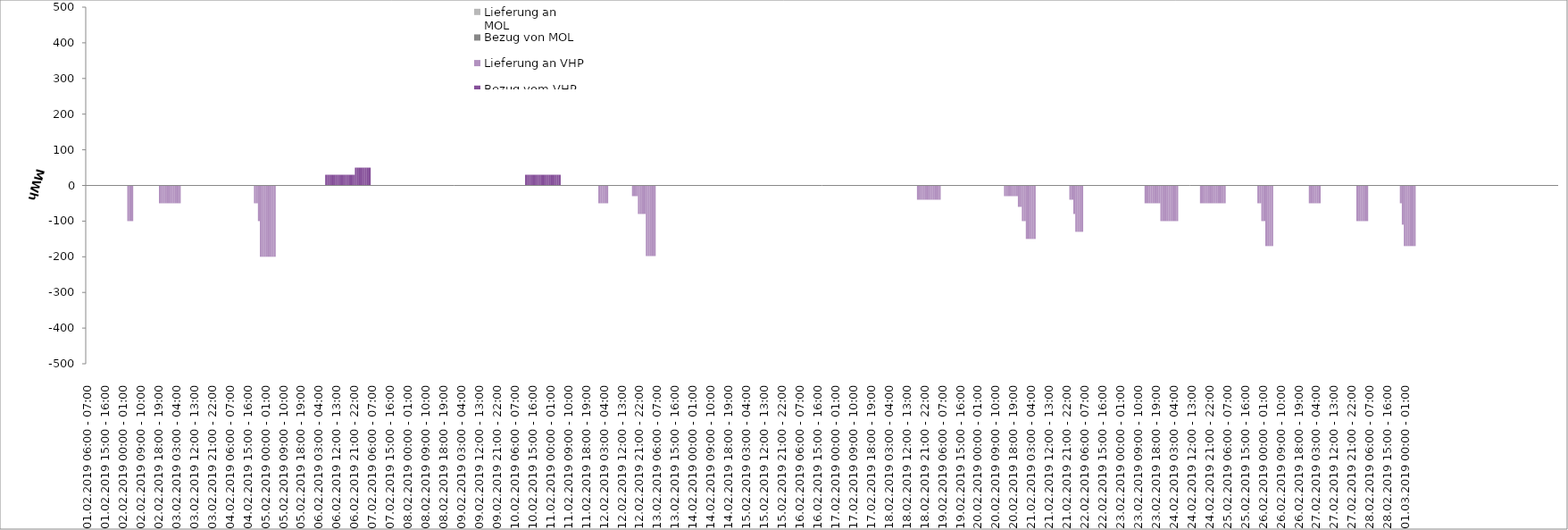
| Category | Bezug vom VHP | Lieferung an VHP | Bezug von MOL | Lieferung an MOL |
|---|---|---|---|---|
| 01.02.2019 06:00 - 07:00 | 0 | 0 | 0 | 0 |
| 01.02.2019 07:00 - 08:00 | 0 | 0 | 0 | 0 |
| 01.02.2019 08:00 - 09:00 | 0 | 0 | 0 | 0 |
| 01.02.2019 09:00 - 10:00 | 0 | 0 | 0 | 0 |
| 01.02.2019 10:00 - 11:00 | 0 | 0 | 0 | 0 |
| 01.02.2019 11:00 - 12:00 | 0 | 0 | 0 | 0 |
| 01.02.2019 12:00 - 13:00 | 0 | 0 | 0 | 0 |
| 01.02.2019 13:00 - 14:00 | 0 | 0 | 0 | 0 |
| 01.02.2019 14:00 - 15:00 | 0 | 0 | 0 | 0 |
| 01.02.2019 15:00 - 16:00 | 0 | 0 | 0 | 0 |
| 01.02.2019 16:00 - 17:00 | 0 | 0 | 0 | 0 |
| 01.02.2019 17:00 - 18:00 | 0 | 0 | 0 | 0 |
| 01.02.2019 18:00 - 19:00 | 0 | 0 | 0 | 0 |
| 01.02.2019 19:00 - 20:00 | 0 | 0 | 0 | 0 |
| 01.02.2019 20:00 - 21:00 | 0 | 0 | 0 | 0 |
| 01.02.2019 21:00 - 22:00 | 0 | 0 | 0 | 0 |
| 01.02.2019 22:00 - 23:00 | 0 | 0 | 0 | 0 |
| 01.02.2019 23:00 - 24:00 | 0 | 0 | 0 | 0 |
| 02.02.2019 00:00 - 01:00 | 0 | 0 | 0 | 0 |
| 02.02.2019 01:00 - 02:00 | 0 | 0 | 0 | 0 |
| 02.02.2019 02:00 - 03:00 | 0 | 0 | 0 | 0 |
| 02.02.2019 03:00 - 04:00 | 0 | -100 | 0 | 0 |
| 02.02.2019 04:00 - 05:00 | 0 | -100 | 0 | 0 |
| 02.02.2019 05:00 - 06:00 | 0 | -100 | 0 | 0 |
| 02.02.2019 06:00 - 07:00 | 0 | 0 | 0 | 0 |
| 02.02.2019 07:00 - 08:00 | 0 | 0 | 0 | 0 |
| 02.02.2019 08:00 - 09:00 | 0 | 0 | 0 | 0 |
| 02.02.2019 09:00 - 10:00 | 0 | 0 | 0 | 0 |
| 02.02.2019 10:00 - 11:00 | 0 | 0 | 0 | 0 |
| 02.02.2019 11:00 - 12:00 | 0 | 0 | 0 | 0 |
| 02.02.2019 12:00 - 13:00 | 0 | 0 | 0 | 0 |
| 02.02.2019 13:00 - 14:00 | 0 | 0 | 0 | 0 |
| 02.02.2019 14:00 - 15:00 | 0 | 0 | 0 | 0 |
| 02.02.2019 15:00 - 16:00 | 0 | 0 | 0 | 0 |
| 02.02.2019 16:00 - 17:00 | 0 | 0 | 0 | 0 |
| 02.02.2019 17:00 - 18:00 | 0 | 0 | 0 | 0 |
| 02.02.2019 18:00 - 19:00 | 0 | 0 | 0 | 0 |
| 02.02.2019 19:00 - 20:00 | 0 | -50 | 0 | 0 |
| 02.02.2019 20:00 - 21:00 | 0 | -50 | 0 | 0 |
| 02.02.2019 21:00 - 22:00 | 0 | -50 | 0 | 0 |
| 02.02.2019 22:00 - 23:00 | 0 | -50 | 0 | 0 |
| 02.02.2019 23:00 - 24:00 | 0 | -50 | 0 | 0 |
| 03.02.2019 00:00 - 01:00 | 0 | -50 | 0 | 0 |
| 03.02.2019 01:00 - 02:00 | 0 | -50 | 0 | 0 |
| 03.02.2019 02:00 - 03:00 | 0 | -50 | 0 | 0 |
| 03.02.2019 03:00 - 04:00 | 0 | -50 | 0 | 0 |
| 03.02.2019 04:00 - 05:00 | 0 | -50 | 0 | 0 |
| 03.02.2019 05:00 - 06:00 | 0 | -50 | 0 | 0 |
| 03.02.2019 06:00 - 07:00 | 0 | 0 | 0 | 0 |
| 03.02.2019 07:00 - 08:00 | 0 | 0 | 0 | 0 |
| 03.02.2019 08:00 - 09:00 | 0 | 0 | 0 | 0 |
| 03.02.2019 09:00 - 10:00 | 0 | 0 | 0 | 0 |
| 03.02.2019 10:00 - 11:00 | 0 | 0 | 0 | 0 |
| 03.02.2019 11:00 - 12:00 | 0 | 0 | 0 | 0 |
| 03.02.2019 12:00 - 13:00 | 0 | 0 | 0 | 0 |
| 03.02.2019 13:00 - 14:00 | 0 | 0 | 0 | 0 |
| 03.02.2019 14:00 - 15:00 | 0 | 0 | 0 | 0 |
| 03.02.2019 15:00 - 16:00 | 0 | 0 | 0 | 0 |
| 03.02.2019 16:00 - 17:00 | 0 | 0 | 0 | 0 |
| 03.02.2019 17:00 - 18:00 | 0 | 0 | 0 | 0 |
| 03.02.2019 18:00 - 19:00 | 0 | 0 | 0 | 0 |
| 03.02.2019 19:00 - 20:00 | 0 | 0 | 0 | 0 |
| 03.02.2019 20:00 - 21:00 | 0 | 0 | 0 | 0 |
| 03.02.2019 21:00 - 22:00 | 0 | 0 | 0 | 0 |
| 03.02.2019 22:00 - 23:00 | 0 | 0 | 0 | 0 |
| 03.02.2019 23:00 - 24:00 | 0 | 0 | 0 | 0 |
| 04.02.2019 00:00 - 01:00 | 0 | 0 | 0 | 0 |
| 04.02.2019 01:00 - 02:00 | 0 | 0 | 0 | 0 |
| 04.02.2019 02:00 - 03:00 | 0 | 0 | 0 | 0 |
| 04.02.2019 03:00 - 04:00 | 0 | 0 | 0 | 0 |
| 04.02.2019 04:00 - 05:00 | 0 | 0 | 0 | 0 |
| 04.02.2019 05:00 - 06:00 | 0 | 0 | 0 | 0 |
| 04.02.2019 06:00 - 07:00 | 0 | 0 | 0 | 0 |
| 04.02.2019 07:00 - 08:00 | 0 | 0 | 0 | 0 |
| 04.02.2019 08:00 - 09:00 | 0 | 0 | 0 | 0 |
| 04.02.2019 09:00 - 10:00 | 0 | 0 | 0 | 0 |
| 04.02.2019 10:00 - 11:00 | 0 | 0 | 0 | 0 |
| 04.02.2019 11:00 - 12:00 | 0 | 0 | 0 | 0 |
| 04.02.2019 12:00 - 13:00 | 0 | 0 | 0 | 0 |
| 04.02.2019 13:00 - 14:00 | 0 | 0 | 0 | 0 |
| 04.02.2019 14:00 - 15:00 | 0 | 0 | 0 | 0 |
| 04.02.2019 15:00 - 16:00 | 0 | 0 | 0 | 0 |
| 04.02.2019 16:00 - 17:00 | 0 | 0 | 0 | 0 |
| 04.02.2019 17:00 - 18:00 | 0 | 0 | 0 | 0 |
| 04.02.2019 18:00 - 19:00 | 0 | 0 | 0 | 0 |
| 04.02.2019 19:00 - 20:00 | 0 | -50 | 0 | 0 |
| 04.02.2019 20:00 - 21:00 | 0 | -50 | 0 | 0 |
| 04.02.2019 21:00 - 22:00 | 0 | -100 | 0 | 0 |
| 04.02.2019 22:00 - 23:00 | 0 | -200 | 0 | 0 |
| 04.02.2019 23:00 - 24:00 | 0 | -200 | 0 | 0 |
| 05.02.2019 00:00 - 01:00 | 0 | -200 | 0 | 0 |
| 05.02.2019 01:00 - 02:00 | 0 | -200 | 0 | 0 |
| 05.02.2019 02:00 - 03:00 | 0 | -200 | 0 | 0 |
| 05.02.2019 03:00 - 04:00 | 0 | -200 | 0 | 0 |
| 05.02.2019 04:00 - 05:00 | 0 | -200 | 0 | 0 |
| 05.02.2019 05:00 - 06:00 | 0 | -200 | 0 | 0 |
| 05.02.2019 06:00 - 07:00 | 0 | 0 | 0 | 0 |
| 05.02.2019 07:00 - 08:00 | 0 | 0 | 0 | 0 |
| 05.02.2019 08:00 - 09:00 | 0 | 0 | 0 | 0 |
| 05.02.2019 09:00 - 10:00 | 0 | 0 | 0 | 0 |
| 05.02.2019 10:00 - 11:00 | 0 | 0 | 0 | 0 |
| 05.02.2019 11:00 - 12:00 | 0 | 0 | 0 | 0 |
| 05.02.2019 12:00 - 13:00 | 0 | 0 | 0 | 0 |
| 05.02.2019 13:00 - 14:00 | 0 | 0 | 0 | 0 |
| 05.02.2019 14:00 - 15:00 | 0 | 0 | 0 | 0 |
| 05.02.2019 15:00 - 16:00 | 0 | 0 | 0 | 0 |
| 05.02.2019 16:00 - 17:00 | 0 | 0 | 0 | 0 |
| 05.02.2019 17:00 - 18:00 | 0 | 0 | 0 | 0 |
| 05.02.2019 18:00 - 19:00 | 0 | 0 | 0 | 0 |
| 05.02.2019 19:00 - 20:00 | 0 | 0 | 0 | 0 |
| 05.02.2019 20:00 - 21:00 | 0 | 0 | 0 | 0 |
| 05.02.2019 21:00 - 22:00 | 0 | 0 | 0 | 0 |
| 05.02.2019 22:00 - 23:00 | 0 | 0 | 0 | 0 |
| 05.02.2019 23:00 - 24:00 | 0 | 0 | 0 | 0 |
| 06.02.2019 00:00 - 01:00 | 0 | 0 | 0 | 0 |
| 06.02.2019 01:00 - 02:00 | 0 | 0 | 0 | 0 |
| 06.02.2019 02:00 - 03:00 | 0 | 0 | 0 | 0 |
| 06.02.2019 03:00 - 04:00 | 0 | 0 | 0 | 0 |
| 06.02.2019 04:00 - 05:00 | 0 | 0 | 0 | 0 |
| 06.02.2019 05:00 - 06:00 | 0 | 0 | 0 | 0 |
| 06.02.2019 06:00 - 07:00 | 0 | 0 | 0 | 0 |
| 06.02.2019 07:00 - 08:00 | 30 | 0 | 0 | 0 |
| 06.02.2019 08:00 - 09:00 | 30 | 0 | 0 | 0 |
| 06.02.2019 09:00 - 10:00 | 30 | 0 | 0 | 0 |
| 06.02.2019 10:00 - 11:00 | 30 | 0 | 0 | 0 |
| 06.02.2019 11:00 - 12:00 | 30 | 0 | 0 | 0 |
| 06.02.2019 12:00 - 13:00 | 30 | 0 | 0 | 0 |
| 06.02.2019 13:00 - 14:00 | 30 | 0 | 0 | 0 |
| 06.02.2019 14:00 - 15:00 | 30 | 0 | 0 | 0 |
| 06.02.2019 15:00 - 16:00 | 30 | 0 | 0 | 0 |
| 06.02.2019 16:00 - 17:00 | 30 | 0 | 0 | 0 |
| 06.02.2019 17:00 - 18:00 | 30 | 0 | 0 | 0 |
| 06.02.2019 18:00 - 19:00 | 30 | 0 | 0 | 0 |
| 06.02.2019 19:00 - 20:00 | 30 | 0 | 0 | 0 |
| 06.02.2019 20:00 - 21:00 | 30 | 0 | 0 | 0 |
| 06.02.2019 21:00 - 22:00 | 30 | 0 | 0 | 0 |
| 06.02.2019 22:00 - 23:00 | 50 | 0 | 0 | 0 |
| 06.02.2019 23:00 - 24:00 | 50 | 0 | 0 | 0 |
| 07.02.2019 00:00 - 01:00 | 50 | 0 | 0 | 0 |
| 07.02.2019 01:00 - 02:00 | 50 | 0 | 0 | 0 |
| 07.02.2019 02:00 - 03:00 | 50 | 0 | 0 | 0 |
| 07.02.2019 03:00 - 04:00 | 50 | 0 | 0 | 0 |
| 07.02.2019 04:00 - 05:00 | 50 | 0 | 0 | 0 |
| 07.02.2019 05:00 - 06:00 | 50 | 0 | 0 | 0 |
| 07.02.2019 06:00 - 07:00 | 0 | 0 | 0 | 0 |
| 07.02.2019 07:00 - 08:00 | 0 | 0 | 0 | 0 |
| 07.02.2019 08:00 - 09:00 | 0 | 0 | 0 | 0 |
| 07.02.2019 09:00 - 10:00 | 0 | 0 | 0 | 0 |
| 07.02.2019 10:00 - 11:00 | 0 | 0 | 0 | 0 |
| 07.02.2019 11:00 - 12:00 | 0 | 0 | 0 | 0 |
| 07.02.2019 12:00 - 13:00 | 0 | 0 | 0 | 0 |
| 07.02.2019 13:00 - 14:00 | 0 | 0 | 0 | 0 |
| 07.02.2019 14:00 - 15:00 | 0 | 0 | 0 | 0 |
| 07.02.2019 15:00 - 16:00 | 0 | 0 | 0 | 0 |
| 07.02.2019 16:00 - 17:00 | 0 | 0 | 0 | 0 |
| 07.02.2019 17:00 - 18:00 | 0 | 0 | 0 | 0 |
| 07.02.2019 18:00 - 19:00 | 0 | 0 | 0 | 0 |
| 07.02.2019 19:00 - 20:00 | 0 | 0 | 0 | 0 |
| 07.02.2019 20:00 - 21:00 | 0 | 0 | 0 | 0 |
| 07.02.2019 21:00 - 22:00 | 0 | 0 | 0 | 0 |
| 07.02.2019 22:00 - 23:00 | 0 | 0 | 0 | 0 |
| 07.02.2019 23:00 - 24:00 | 0 | 0 | 0 | 0 |
| 08.02.2019 00:00 - 01:00 | 0 | 0 | 0 | 0 |
| 08.02.2019 01:00 - 02:00 | 0 | 0 | 0 | 0 |
| 08.02.2019 02:00 - 03:00 | 0 | 0 | 0 | 0 |
| 08.02.2019 03:00 - 04:00 | 0 | 0 | 0 | 0 |
| 08.02.2019 04:00 - 05:00 | 0 | 0 | 0 | 0 |
| 08.02.2019 05:00 - 06:00 | 0 | 0 | 0 | 0 |
| 08.02.2019 06:00 - 07:00 | 0 | 0 | 0 | 0 |
| 08.02.2019 07:00 - 08:00 | 0 | 0 | 0 | 0 |
| 08.02.2019 08:00 - 09:00 | 0 | 0 | 0 | 0 |
| 08.02.2019 09:00 - 10:00 | 0 | 0 | 0 | 0 |
| 08.02.2019 10:00 - 11:00 | 0 | 0 | 0 | 0 |
| 08.02.2019 11:00 - 12:00 | 0 | 0 | 0 | 0 |
| 08.02.2019 12:00 - 13:00 | 0 | 0 | 0 | 0 |
| 08.02.2019 13:00 - 14:00 | 0 | 0 | 0 | 0 |
| 08.02.2019 14:00 - 15:00 | 0 | 0 | 0 | 0 |
| 08.02.2019 15:00 - 16:00 | 0 | 0 | 0 | 0 |
| 08.02.2019 16:00 - 17:00 | 0 | 0 | 0 | 0 |
| 08.02.2019 17:00 - 18:00 | 0 | 0 | 0 | 0 |
| 08.02.2019 18:00 - 19:00 | 0 | 0 | 0 | 0 |
| 08.02.2019 19:00 - 20:00 | 0 | 0 | 0 | 0 |
| 08.02.2019 20:00 - 21:00 | 0 | 0 | 0 | 0 |
| 08.02.2019 21:00 - 22:00 | 0 | 0 | 0 | 0 |
| 08.02.2019 22:00 - 23:00 | 0 | 0 | 0 | 0 |
| 08.02.2019 23:00 - 24:00 | 0 | 0 | 0 | 0 |
| 09.02.2019 00:00 - 01:00 | 0 | 0 | 0 | 0 |
| 09.02.2019 01:00 - 02:00 | 0 | 0 | 0 | 0 |
| 09.02.2019 02:00 - 03:00 | 0 | 0 | 0 | 0 |
| 09.02.2019 03:00 - 04:00 | 0 | 0 | 0 | 0 |
| 09.02.2019 04:00 - 05:00 | 0 | 0 | 0 | 0 |
| 09.02.2019 05:00 - 06:00 | 0 | 0 | 0 | 0 |
| 09.02.2019 06:00 - 07:00 | 0 | 0 | 0 | 0 |
| 09.02.2019 07:00 - 08:00 | 0 | 0 | 0 | 0 |
| 09.02.2019 08:00 - 09:00 | 0 | 0 | 0 | 0 |
| 09.02.2019 09:00 - 10:00 | 0 | 0 | 0 | 0 |
| 09.02.2019 10:00 - 11:00 | 0 | 0 | 0 | 0 |
| 09.02.2019 11:00 - 12:00 | 0 | 0 | 0 | 0 |
| 09.02.2019 12:00 - 13:00 | 0 | 0 | 0 | 0 |
| 09.02.2019 13:00 - 14:00 | 0 | 0 | 0 | 0 |
| 09.02.2019 14:00 - 15:00 | 0 | 0 | 0 | 0 |
| 09.02.2019 15:00 - 16:00 | 0 | 0 | 0 | 0 |
| 09.02.2019 16:00 - 17:00 | 0 | 0 | 0 | 0 |
| 09.02.2019 17:00 - 18:00 | 0 | 0 | 0 | 0 |
| 09.02.2019 18:00 - 19:00 | 0 | 0 | 0 | 0 |
| 09.02.2019 19:00 - 20:00 | 0 | 0 | 0 | 0 |
| 09.02.2019 20:00 - 21:00 | 0 | 0 | 0 | 0 |
| 09.02.2019 21:00 - 22:00 | 0 | 0 | 0 | 0 |
| 09.02.2019 22:00 - 23:00 | 0 | 0 | 0 | 0 |
| 09.02.2019 23:00 - 24:00 | 0 | 0 | 0 | 0 |
| 10.02.2019 00:00 - 01:00 | 0 | 0 | 0 | 0 |
| 10.02.2019 01:00 - 02:00 | 0 | 0 | 0 | 0 |
| 10.02.2019 02:00 - 03:00 | 0 | 0 | 0 | 0 |
| 10.02.2019 03:00 - 04:00 | 0 | 0 | 0 | 0 |
| 10.02.2019 04:00 - 05:00 | 0 | 0 | 0 | 0 |
| 10.02.2019 05:00 - 06:00 | 0 | 0 | 0 | 0 |
| 10.02.2019 06:00 - 07:00 | 0 | 0 | 0 | 0 |
| 10.02.2019 07:00 - 08:00 | 0 | 0 | 0 | 0 |
| 10.02.2019 08:00 - 09:00 | 0 | 0 | 0 | 0 |
| 10.02.2019 09:00 - 10:00 | 0 | 0 | 0 | 0 |
| 10.02.2019 10:00 - 11:00 | 0 | 0 | 0 | 0 |
| 10.02.2019 11:00 - 12:00 | 0 | 0 | 0 | 0 |
| 10.02.2019 12:00 - 13:00 | 30 | 0 | 0 | 0 |
| 10.02.2019 13:00 - 14:00 | 30 | 0 | 0 | 0 |
| 10.02.2019 14:00 - 15:00 | 30 | 0 | 0 | 0 |
| 10.02.2019 15:00 - 16:00 | 30 | 0 | 0 | 0 |
| 10.02.2019 16:00 - 17:00 | 30 | 0 | 0 | 0 |
| 10.02.2019 17:00 - 18:00 | 30 | 0 | 0 | 0 |
| 10.02.2019 18:00 - 19:00 | 30 | 0 | 0 | 0 |
| 10.02.2019 19:00 - 20:00 | 30 | 0 | 0 | 0 |
| 10.02.2019 20:00 - 21:00 | 30 | 0 | 0 | 0 |
| 10.02.2019 21:00 - 22:00 | 30 | 0 | 0 | 0 |
| 10.02.2019 22:00 - 23:00 | 30 | 0 | 0 | 0 |
| 10.02.2019 23:00 - 24:00 | 30 | 0 | 0 | 0 |
| 11.02.2019 00:00 - 01:00 | 30 | 0 | 0 | 0 |
| 11.02.2019 01:00 - 02:00 | 30 | 0 | 0 | 0 |
| 11.02.2019 02:00 - 03:00 | 30 | 0 | 0 | 0 |
| 11.02.2019 03:00 - 04:00 | 30 | 0 | 0 | 0 |
| 11.02.2019 04:00 - 05:00 | 30 | 0 | 0 | 0 |
| 11.02.2019 05:00 - 06:00 | 30 | 0 | 0 | 0 |
| 11.02.2019 06:00 - 07:00 | 0 | 0 | 0 | 0 |
| 11.02.2019 07:00 - 08:00 | 0 | 0 | 0 | 0 |
| 11.02.2019 08:00 - 09:00 | 0 | 0 | 0 | 0 |
| 11.02.2019 09:00 - 10:00 | 0 | 0 | 0 | 0 |
| 11.02.2019 10:00 - 11:00 | 0 | 0 | 0 | 0 |
| 11.02.2019 11:00 - 12:00 | 0 | 0 | 0 | 0 |
| 11.02.2019 12:00 - 13:00 | 0 | 0 | 0 | 0 |
| 11.02.2019 13:00 - 14:00 | 0 | 0 | 0 | 0 |
| 11.02.2019 14:00 - 15:00 | 0 | 0 | 0 | 0 |
| 11.02.2019 15:00 - 16:00 | 0 | 0 | 0 | 0 |
| 11.02.2019 16:00 - 17:00 | 0 | 0 | 0 | 0 |
| 11.02.2019 17:00 - 18:00 | 0 | 0 | 0 | 0 |
| 11.02.2019 18:00 - 19:00 | 0 | 0 | 0 | 0 |
| 11.02.2019 19:00 - 20:00 | 0 | 0 | 0 | 0 |
| 11.02.2019 20:00 - 21:00 | 0 | 0 | 0 | 0 |
| 11.02.2019 21:00 - 22:00 | 0 | 0 | 0 | 0 |
| 11.02.2019 22:00 - 23:00 | 0 | 0 | 0 | 0 |
| 11.02.2019 23:00 - 24:00 | 0 | 0 | 0 | 0 |
| 12.02.2019 00:00 - 01:00 | 0 | 0 | 0 | 0 |
| 12.02.2019 01:00 - 02:00 | 0 | -50 | 0 | 0 |
| 12.02.2019 02:00 - 03:00 | 0 | -50 | 0 | 0 |
| 12.02.2019 03:00 - 04:00 | 0 | -50 | 0 | 0 |
| 12.02.2019 04:00 - 05:00 | 0 | -50 | 0 | 0 |
| 12.02.2019 05:00 - 06:00 | 0 | -50 | 0 | 0 |
| 12.02.2019 06:00 - 07:00 | 0 | 0 | 0 | 0 |
| 12.02.2019 07:00 - 08:00 | 0 | 0 | 0 | 0 |
| 12.02.2019 08:00 - 09:00 | 0 | 0 | 0 | 0 |
| 12.02.2019 09:00 - 10:00 | 0 | 0 | 0 | 0 |
| 12.02.2019 10:00 - 11:00 | 0 | 0 | 0 | 0 |
| 12.02.2019 11:00 - 12:00 | 0 | 0 | 0 | 0 |
| 12.02.2019 12:00 - 13:00 | 0 | 0 | 0 | 0 |
| 12.02.2019 13:00 - 14:00 | 0 | 0 | 0 | 0 |
| 12.02.2019 14:00 - 15:00 | 0 | 0 | 0 | 0 |
| 12.02.2019 15:00 - 16:00 | 0 | 0 | 0 | 0 |
| 12.02.2019 16:00 - 17:00 | 0 | 0 | 0 | 0 |
| 12.02.2019 17:00 - 18:00 | 0 | 0 | 0 | 0 |
| 12.02.2019 18:00 - 19:00 | 0 | -30 | 0 | 0 |
| 12.02.2019 19:00 - 20:00 | 0 | -30 | 0 | 0 |
| 12.02.2019 20:00 - 21:00 | 0 | -30 | 0 | 0 |
| 12.02.2019 21:00 - 22:00 | 0 | -80 | 0 | 0 |
| 12.02.2019 22:00 - 23:00 | 0 | -80 | 0 | 0 |
| 12.02.2019 23:00 - 24:00 | 0 | -80 | 0 | 0 |
| 13.02.2019 00:00 - 01:00 | 0 | -80 | 0 | 0 |
| 13.02.2019 01:00 - 02:00 | 0 | -198 | 0 | 0 |
| 13.02.2019 02:00 - 03:00 | 0 | -198 | 0 | 0 |
| 13.02.2019 03:00 - 04:00 | 0 | -198 | 0 | 0 |
| 13.02.2019 04:00 - 05:00 | 0 | -198 | 0 | 0 |
| 13.02.2019 05:00 - 06:00 | 0 | -198 | 0 | 0 |
| 13.02.2019 06:00 - 07:00 | 0 | 0 | 0 | 0 |
| 13.02.2019 07:00 - 08:00 | 0 | 0 | 0 | 0 |
| 13.02.2019 08:00 - 09:00 | 0 | 0 | 0 | 0 |
| 13.02.2019 09:00 - 10:00 | 0 | 0 | 0 | 0 |
| 13.02.2019 10:00 - 11:00 | 0 | 0 | 0 | 0 |
| 13.02.2019 11:00 - 12:00 | 0 | 0 | 0 | 0 |
| 13.02.2019 12:00 - 13:00 | 0 | 0 | 0 | 0 |
| 13.02.2019 13:00 - 14:00 | 0 | 0 | 0 | 0 |
| 13.02.2019 14:00 - 15:00 | 0 | 0 | 0 | 0 |
| 13.02.2019 15:00 - 16:00 | 0 | 0 | 0 | 0 |
| 13.02.2019 16:00 - 17:00 | 0 | 0 | 0 | 0 |
| 13.02.2019 17:00 - 18:00 | 0 | 0 | 0 | 0 |
| 13.02.2019 18:00 - 19:00 | 0 | 0 | 0 | 0 |
| 13.02.2019 19:00 - 20:00 | 0 | 0 | 0 | 0 |
| 13.02.2019 20:00 - 21:00 | 0 | 0 | 0 | 0 |
| 13.02.2019 21:00 - 22:00 | 0 | 0 | 0 | 0 |
| 13.02.2019 22:00 - 23:00 | 0 | 0 | 0 | 0 |
| 13.02.2019 23:00 - 24:00 | 0 | 0 | 0 | 0 |
| 14.02.2019 00:00 - 01:00 | 0 | 0 | 0 | 0 |
| 14.02.2019 01:00 - 02:00 | 0 | 0 | 0 | 0 |
| 14.02.2019 02:00 - 03:00 | 0 | 0 | 0 | 0 |
| 14.02.2019 03:00 - 04:00 | 0 | 0 | 0 | 0 |
| 14.02.2019 04:00 - 05:00 | 0 | 0 | 0 | 0 |
| 14.02.2019 05:00 - 06:00 | 0 | 0 | 0 | 0 |
| 14.02.2019 06:00 - 07:00 | 0 | 0 | 0 | 0 |
| 14.02.2019 07:00 - 08:00 | 0 | 0 | 0 | 0 |
| 14.02.2019 08:00 - 09:00 | 0 | 0 | 0 | 0 |
| 14.02.2019 09:00 - 10:00 | 0 | 0 | 0 | 0 |
| 14.02.2019 10:00 - 11:00 | 0 | 0 | 0 | 0 |
| 14.02.2019 11:00 - 12:00 | 0 | 0 | 0 | 0 |
| 14.02.2019 12:00 - 13:00 | 0 | 0 | 0 | 0 |
| 14.02.2019 13:00 - 14:00 | 0 | 0 | 0 | 0 |
| 14.02.2019 14:00 - 15:00 | 0 | 0 | 0 | 0 |
| 14.02.2019 15:00 - 16:00 | 0 | 0 | 0 | 0 |
| 14.02.2019 16:00 - 17:00 | 0 | 0 | 0 | 0 |
| 14.02.2019 17:00 - 18:00 | 0 | 0 | 0 | 0 |
| 14.02.2019 18:00 - 19:00 | 0 | 0 | 0 | 0 |
| 14.02.2019 19:00 - 20:00 | 0 | 0 | 0 | 0 |
| 14.02.2019 20:00 - 21:00 | 0 | 0 | 0 | 0 |
| 14.02.2019 21:00 - 22:00 | 0 | 0 | 0 | 0 |
| 14.02.2019 22:00 - 23:00 | 0 | 0 | 0 | 0 |
| 14.02.2019 23:00 - 24:00 | 0 | 0 | 0 | 0 |
| 15.02.2019 00:00 - 01:00 | 0 | 0 | 0 | 0 |
| 15.02.2019 01:00 - 02:00 | 0 | 0 | 0 | 0 |
| 15.02.2019 02:00 - 03:00 | 0 | 0 | 0 | 0 |
| 15.02.2019 03:00 - 04:00 | 0 | 0 | 0 | 0 |
| 15.02.2019 04:00 - 05:00 | 0 | 0 | 0 | 0 |
| 15.02.2019 05:00 - 06:00 | 0 | 0 | 0 | 0 |
| 15.02.2019 06:00 - 07:00 | 0 | 0 | 0 | 0 |
| 15.02.2019 07:00 - 08:00 | 0 | 0 | 0 | 0 |
| 15.02.2019 08:00 - 09:00 | 0 | 0 | 0 | 0 |
| 15.02.2019 09:00 - 10:00 | 0 | 0 | 0 | 0 |
| 15.02.2019 10:00 - 11:00 | 0 | 0 | 0 | 0 |
| 15.02.2019 11:00 - 12:00 | 0 | 0 | 0 | 0 |
| 15.02.2019 12:00 - 13:00 | 0 | 0 | 0 | 0 |
| 15.02.2019 13:00 - 14:00 | 0 | 0 | 0 | 0 |
| 15.02.2019 14:00 - 15:00 | 0 | 0 | 0 | 0 |
| 15.02.2019 15:00 - 16:00 | 0 | 0 | 0 | 0 |
| 15.02.2019 16:00 - 17:00 | 0 | 0 | 0 | 0 |
| 15.02.2019 17:00 - 18:00 | 0 | 0 | 0 | 0 |
| 15.02.2019 18:00 - 19:00 | 0 | 0 | 0 | 0 |
| 15.02.2019 19:00 - 20:00 | 0 | 0 | 0 | 0 |
| 15.02.2019 20:00 - 21:00 | 0 | 0 | 0 | 0 |
| 15.02.2019 21:00 - 22:00 | 0 | 0 | 0 | 0 |
| 15.02.2019 22:00 - 23:00 | 0 | 0 | 0 | 0 |
| 15.02.2019 23:00 - 24:00 | 0 | 0 | 0 | 0 |
| 16.02.2019 00:00 - 01:00 | 0 | 0 | 0 | 0 |
| 16.02.2019 01:00 - 02:00 | 0 | 0 | 0 | 0 |
| 16.02.2019 02:00 - 03:00 | 0 | 0 | 0 | 0 |
| 16.02.2019 03:00 - 04:00 | 0 | 0 | 0 | 0 |
| 16.02.2019 04:00 - 05:00 | 0 | 0 | 0 | 0 |
| 16.02.2019 05:00 - 06:00 | 0 | 0 | 0 | 0 |
| 16.02.2019 06:00 - 07:00 | 0 | 0 | 0 | 0 |
| 16.02.2019 07:00 - 08:00 | 0 | 0 | 0 | 0 |
| 16.02.2019 08:00 - 09:00 | 0 | 0 | 0 | 0 |
| 16.02.2019 09:00 - 10:00 | 0 | 0 | 0 | 0 |
| 16.02.2019 10:00 - 11:00 | 0 | 0 | 0 | 0 |
| 16.02.2019 11:00 - 12:00 | 0 | 0 | 0 | 0 |
| 16.02.2019 12:00 - 13:00 | 0 | 0 | 0 | 0 |
| 16.02.2019 13:00 - 14:00 | 0 | 0 | 0 | 0 |
| 16.02.2019 14:00 - 15:00 | 0 | 0 | 0 | 0 |
| 16.02.2019 15:00 - 16:00 | 0 | 0 | 0 | 0 |
| 16.02.2019 16:00 - 17:00 | 0 | 0 | 0 | 0 |
| 16.02.2019 17:00 - 18:00 | 0 | 0 | 0 | 0 |
| 16.02.2019 18:00 - 19:00 | 0 | 0 | 0 | 0 |
| 16.02.2019 19:00 - 20:00 | 0 | 0 | 0 | 0 |
| 16.02.2019 20:00 - 21:00 | 0 | 0 | 0 | 0 |
| 16.02.2019 21:00 - 22:00 | 0 | 0 | 0 | 0 |
| 16.02.2019 22:00 - 23:00 | 0 | 0 | 0 | 0 |
| 16.02.2019 23:00 - 24:00 | 0 | 0 | 0 | 0 |
| 17.02.2019 00:00 - 01:00 | 0 | 0 | 0 | 0 |
| 17.02.2019 01:00 - 02:00 | 0 | 0 | 0 | 0 |
| 17.02.2019 02:00 - 03:00 | 0 | 0 | 0 | 0 |
| 17.02.2019 03:00 - 04:00 | 0 | 0 | 0 | 0 |
| 17.02.2019 04:00 - 05:00 | 0 | 0 | 0 | 0 |
| 17.02.2019 05:00 - 06:00 | 0 | 0 | 0 | 0 |
| 17.02.2019 06:00 - 07:00 | 0 | 0 | 0 | 0 |
| 17.02.2019 07:00 - 08:00 | 0 | 0 | 0 | 0 |
| 17.02.2019 08:00 - 09:00 | 0 | 0 | 0 | 0 |
| 17.02.2019 09:00 - 10:00 | 0 | 0 | 0 | 0 |
| 17.02.2019 10:00 - 11:00 | 0 | 0 | 0 | 0 |
| 17.02.2019 11:00 - 12:00 | 0 | 0 | 0 | 0 |
| 17.02.2019 12:00 - 13:00 | 0 | 0 | 0 | 0 |
| 17.02.2019 13:00 - 14:00 | 0 | 0 | 0 | 0 |
| 17.02.2019 14:00 - 15:00 | 0 | 0 | 0 | 0 |
| 17.02.2019 15:00 - 16:00 | 0 | 0 | 0 | 0 |
| 17.02.2019 16:00 - 17:00 | 0 | 0 | 0 | 0 |
| 17.02.2019 17:00 - 18:00 | 0 | 0 | 0 | 0 |
| 17.02.2019 18:00 - 19:00 | 0 | 0 | 0 | 0 |
| 17.02.2019 19:00 - 20:00 | 0 | 0 | 0 | 0 |
| 17.02.2019 20:00 - 21:00 | 0 | 0 | 0 | 0 |
| 17.02.2019 21:00 - 22:00 | 0 | 0 | 0 | 0 |
| 17.02.2019 22:00 - 23:00 | 0 | 0 | 0 | 0 |
| 17.02.2019 23:00 - 24:00 | 0 | 0 | 0 | 0 |
| 18.02.2019 00:00 - 01:00 | 0 | 0 | 0 | 0 |
| 18.02.2019 01:00 - 02:00 | 0 | 0 | 0 | 0 |
| 18.02.2019 02:00 - 03:00 | 0 | 0 | 0 | 0 |
| 18.02.2019 03:00 - 04:00 | 0 | 0 | 0 | 0 |
| 18.02.2019 04:00 - 05:00 | 0 | 0 | 0 | 0 |
| 18.02.2019 05:00 - 06:00 | 0 | 0 | 0 | 0 |
| 18.02.2019 06:00 - 07:00 | 0 | 0 | 0 | 0 |
| 18.02.2019 07:00 - 08:00 | 0 | 0 | 0 | 0 |
| 18.02.2019 08:00 - 09:00 | 0 | 0 | 0 | 0 |
| 18.02.2019 09:00 - 10:00 | 0 | 0 | 0 | 0 |
| 18.02.2019 10:00 - 11:00 | 0 | 0 | 0 | 0 |
| 18.02.2019 11:00 - 12:00 | 0 | 0 | 0 | 0 |
| 18.02.2019 12:00 - 13:00 | 0 | 0 | 0 | 0 |
| 18.02.2019 13:00 - 14:00 | 0 | 0 | 0 | 0 |
| 18.02.2019 14:00 - 15:00 | 0 | 0 | 0 | 0 |
| 18.02.2019 15:00 - 16:00 | 0 | 0 | 0 | 0 |
| 18.02.2019 16:00 - 17:00 | 0 | 0 | 0 | 0 |
| 18.02.2019 17:00 - 18:00 | 0 | 0 | 0 | 0 |
| 18.02.2019 18:00 - 19:00 | 0 | -40 | 0 | 0 |
| 18.02.2019 19:00 - 20:00 | 0 | -40 | 0 | 0 |
| 18.02.2019 20:00 - 21:00 | 0 | -40 | 0 | 0 |
| 18.02.2019 21:00 - 22:00 | 0 | -40 | 0 | 0 |
| 18.02.2019 22:00 - 23:00 | 0 | -40 | 0 | 0 |
| 18.02.2019 23:00 - 24:00 | 0 | -40 | 0 | 0 |
| 19.02.2019 00:00 - 01:00 | 0 | -40 | 0 | 0 |
| 19.02.2019 01:00 - 02:00 | 0 | -40 | 0 | 0 |
| 19.02.2019 02:00 - 03:00 | 0 | -40 | 0 | 0 |
| 19.02.2019 03:00 - 04:00 | 0 | -40 | 0 | 0 |
| 19.02.2019 04:00 - 05:00 | 0 | -40 | 0 | 0 |
| 19.02.2019 05:00 - 06:00 | 0 | -40 | 0 | 0 |
| 19.02.2019 06:00 - 07:00 | 0 | 0 | 0 | 0 |
| 19.02.2019 07:00 - 08:00 | 0 | 0 | 0 | 0 |
| 19.02.2019 08:00 - 09:00 | 0 | 0 | 0 | 0 |
| 19.02.2019 09:00 - 10:00 | 0 | 0 | 0 | 0 |
| 19.02.2019 10:00 - 11:00 | 0 | 0 | 0 | 0 |
| 19.02.2019 11:00 - 12:00 | 0 | 0 | 0 | 0 |
| 19.02.2019 12:00 - 13:00 | 0 | 0 | 0 | 0 |
| 19.02.2019 13:00 - 14:00 | 0 | 0 | 0 | 0 |
| 19.02.2019 14:00 - 15:00 | 0 | 0 | 0 | 0 |
| 19.02.2019 15:00 - 16:00 | 0 | 0 | 0 | 0 |
| 19.02.2019 16:00 - 17:00 | 0 | 0 | 0 | 0 |
| 19.02.2019 17:00 - 18:00 | 0 | 0 | 0 | 0 |
| 19.02.2019 18:00 - 19:00 | 0 | 0 | 0 | 0 |
| 19.02.2019 19:00 - 20:00 | 0 | 0 | 0 | 0 |
| 19.02.2019 20:00 - 21:00 | 0 | 0 | 0 | 0 |
| 19.02.2019 21:00 - 22:00 | 0 | 0 | 0 | 0 |
| 19.02.2019 22:00 - 23:00 | 0 | 0 | 0 | 0 |
| 19.02.2019 23:00 - 24:00 | 0 | 0 | 0 | 0 |
| 20.02.2019 00:00 - 01:00 | 0 | 0 | 0 | 0 |
| 20.02.2019 01:00 - 02:00 | 0 | 0 | 0 | 0 |
| 20.02.2019 02:00 - 03:00 | 0 | 0 | 0 | 0 |
| 20.02.2019 03:00 - 04:00 | 0 | 0 | 0 | 0 |
| 20.02.2019 04:00 - 05:00 | 0 | 0 | 0 | 0 |
| 20.02.2019 05:00 - 06:00 | 0 | 0 | 0 | 0 |
| 20.02.2019 06:00 - 07:00 | 0 | 0 | 0 | 0 |
| 20.02.2019 07:00 - 08:00 | 0 | 0 | 0 | 0 |
| 20.02.2019 08:00 - 09:00 | 0 | 0 | 0 | 0 |
| 20.02.2019 09:00 - 10:00 | 0 | 0 | 0 | 0 |
| 20.02.2019 10:00 - 11:00 | 0 | 0 | 0 | 0 |
| 20.02.2019 11:00 - 12:00 | 0 | 0 | 0 | 0 |
| 20.02.2019 12:00 - 13:00 | 0 | 0 | 0 | 0 |
| 20.02.2019 13:00 - 14:00 | 0 | 0 | 0 | 0 |
| 20.02.2019 14:00 - 15:00 | 0 | -30 | 0 | 0 |
| 20.02.2019 15:00 - 16:00 | 0 | -30 | 0 | 0 |
| 20.02.2019 16:00 - 17:00 | 0 | -30 | 0 | 0 |
| 20.02.2019 17:00 - 18:00 | 0 | -30 | 0 | 0 |
| 20.02.2019 18:00 - 19:00 | 0 | -30 | 0 | 0 |
| 20.02.2019 19:00 - 20:00 | 0 | -30 | 0 | 0 |
| 20.02.2019 20:00 - 21:00 | 0 | -30 | 0 | 0 |
| 20.02.2019 21:00 - 22:00 | 0 | -60 | 0 | 0 |
| 20.02.2019 22:00 - 23:00 | 0 | -60 | 0 | 0 |
| 20.02.2019 23:00 - 24:00 | 0 | -100 | 0 | 0 |
| 21.02.2019 00:00 - 01:00 | 0 | -100 | 0 | 0 |
| 21.02.2019 01:00 - 02:00 | 0 | -150 | 0 | 0 |
| 21.02.2019 02:00 - 03:00 | 0 | -150 | 0 | 0 |
| 21.02.2019 03:00 - 04:00 | 0 | -150 | 0 | 0 |
| 21.02.2019 04:00 - 05:00 | 0 | -150 | 0 | 0 |
| 21.02.2019 05:00 - 06:00 | 0 | -150 | 0 | 0 |
| 21.02.2019 06:00 - 07:00 | 0 | 0 | 0 | 0 |
| 21.02.2019 07:00 - 08:00 | 0 | 0 | 0 | 0 |
| 21.02.2019 08:00 - 09:00 | 0 | 0 | 0 | 0 |
| 21.02.2019 09:00 - 10:00 | 0 | 0 | 0 | 0 |
| 21.02.2019 10:00 - 11:00 | 0 | 0 | 0 | 0 |
| 21.02.2019 11:00 - 12:00 | 0 | 0 | 0 | 0 |
| 21.02.2019 12:00 - 13:00 | 0 | 0 | 0 | 0 |
| 21.02.2019 13:00 - 14:00 | 0 | 0 | 0 | 0 |
| 21.02.2019 14:00 - 15:00 | 0 | 0 | 0 | 0 |
| 21.02.2019 15:00 - 16:00 | 0 | 0 | 0 | 0 |
| 21.02.2019 16:00 - 17:00 | 0 | 0 | 0 | 0 |
| 21.02.2019 17:00 - 18:00 | 0 | 0 | 0 | 0 |
| 21.02.2019 18:00 - 19:00 | 0 | 0 | 0 | 0 |
| 21.02.2019 19:00 - 20:00 | 0 | 0 | 0 | 0 |
| 21.02.2019 20:00 - 21:00 | 0 | 0 | 0 | 0 |
| 21.02.2019 21:00 - 22:00 | 0 | 0 | 0 | 0 |
| 21.02.2019 22:00 - 23:00 | 0 | 0 | 0 | 0 |
| 21.02.2019 23:00 - 24:00 | 0 | -40 | 0 | 0 |
| 22.02.2019 00:00 - 01:00 | 0 | -40 | 0 | 0 |
| 22.02.2019 01:00 - 02:00 | 0 | -80 | 0 | 0 |
| 22.02.2019 02:00 - 03:00 | 0 | -130 | 0 | 0 |
| 22.02.2019 03:00 - 04:00 | 0 | -130 | 0 | 0 |
| 22.02.2019 04:00 - 05:00 | 0 | -130 | 0 | 0 |
| 22.02.2019 05:00 - 06:00 | 0 | -130 | 0 | 0 |
| 22.02.2019 06:00 - 07:00 | 0 | 0 | 0 | 0 |
| 22.02.2019 07:00 - 08:00 | 0 | 0 | 0 | 0 |
| 22.02.2019 08:00 - 09:00 | 0 | 0 | 0 | 0 |
| 22.02.2019 09:00 - 10:00 | 0 | 0 | 0 | 0 |
| 22.02.2019 10:00 - 11:00 | 0 | 0 | 0 | 0 |
| 22.02.2019 11:00 - 12:00 | 0 | 0 | 0 | 0 |
| 22.02.2019 12:00 - 13:00 | 0 | 0 | 0 | 0 |
| 22.02.2019 13:00 - 14:00 | 0 | 0 | 0 | 0 |
| 22.02.2019 14:00 - 15:00 | 0 | 0 | 0 | 0 |
| 22.02.2019 15:00 - 16:00 | 0 | 0 | 0 | 0 |
| 22.02.2019 16:00 - 17:00 | 0 | 0 | 0 | 0 |
| 22.02.2019 17:00 - 18:00 | 0 | 0 | 0 | 0 |
| 22.02.2019 18:00 - 19:00 | 0 | 0 | 0 | 0 |
| 22.02.2019 19:00 - 20:00 | 0 | 0 | 0 | 0 |
| 22.02.2019 20:00 - 21:00 | 0 | 0 | 0 | 0 |
| 22.02.2019 21:00 - 22:00 | 0 | 0 | 0 | 0 |
| 22.02.2019 22:00 - 23:00 | 0 | 0 | 0 | 0 |
| 22.02.2019 23:00 - 24:00 | 0 | 0 | 0 | 0 |
| 23.02.2019 00:00 - 01:00 | 0 | 0 | 0 | 0 |
| 23.02.2019 01:00 - 02:00 | 0 | 0 | 0 | 0 |
| 23.02.2019 02:00 - 03:00 | 0 | 0 | 0 | 0 |
| 23.02.2019 03:00 - 04:00 | 0 | 0 | 0 | 0 |
| 23.02.2019 04:00 - 05:00 | 0 | 0 | 0 | 0 |
| 23.02.2019 05:00 - 06:00 | 0 | 0 | 0 | 0 |
| 23.02.2019 06:00 - 07:00 | 0 | 0 | 0 | 0 |
| 23.02.2019 07:00 - 08:00 | 0 | 0 | 0 | 0 |
| 23.02.2019 08:00 - 09:00 | 0 | 0 | 0 | 0 |
| 23.02.2019 09:00 - 10:00 | 0 | 0 | 0 | 0 |
| 23.02.2019 10:00 - 11:00 | 0 | 0 | 0 | 0 |
| 23.02.2019 11:00 - 12:00 | 0 | 0 | 0 | 0 |
| 23.02.2019 12:00 - 13:00 | 0 | 0 | 0 | 0 |
| 23.02.2019 13:00 - 14:00 | 0 | -50 | 0 | 0 |
| 23.02.2019 14:00 - 15:00 | 0 | -50 | 0 | 0 |
| 23.02.2019 15:00 - 16:00 | 0 | -50 | 0 | 0 |
| 23.02.2019 16:00 - 17:00 | 0 | -50 | 0 | 0 |
| 23.02.2019 17:00 - 18:00 | 0 | -50 | 0 | 0 |
| 23.02.2019 18:00 - 19:00 | 0 | -50 | 0 | 0 |
| 23.02.2019 19:00 - 20:00 | 0 | -50 | 0 | 0 |
| 23.02.2019 20:00 - 21:00 | 0 | -50 | 0 | 0 |
| 23.02.2019 21:00 - 22:00 | 0 | -100 | 0 | 0 |
| 23.02.2019 22:00 - 23:00 | 0 | -100 | 0 | 0 |
| 23.02.2019 23:00 - 24:00 | 0 | -100 | 0 | 0 |
| 24.02.2019 00:00 - 01:00 | 0 | -100 | 0 | 0 |
| 24.02.2019 01:00 - 02:00 | 0 | -100 | 0 | 0 |
| 24.02.2019 02:00 - 03:00 | 0 | -100 | 0 | 0 |
| 24.02.2019 03:00 - 04:00 | 0 | -100 | 0 | 0 |
| 24.02.2019 04:00 - 05:00 | 0 | -100 | 0 | 0 |
| 24.02.2019 05:00 - 06:00 | 0 | -100 | 0 | 0 |
| 24.02.2019 06:00 - 07:00 | 0 | 0 | 0 | 0 |
| 24.02.2019 07:00 - 08:00 | 0 | 0 | 0 | 0 |
| 24.02.2019 08:00 - 09:00 | 0 | 0 | 0 | 0 |
| 24.02.2019 09:00 - 10:00 | 0 | 0 | 0 | 0 |
| 24.02.2019 10:00 - 11:00 | 0 | 0 | 0 | 0 |
| 24.02.2019 11:00 - 12:00 | 0 | 0 | 0 | 0 |
| 24.02.2019 12:00 - 13:00 | 0 | 0 | 0 | 0 |
| 24.02.2019 13:00 - 14:00 | 0 | 0 | 0 | 0 |
| 24.02.2019 14:00 - 15:00 | 0 | 0 | 0 | 0 |
| 24.02.2019 15:00 - 16:00 | 0 | 0 | 0 | 0 |
| 24.02.2019 16:00 - 17:00 | 0 | 0 | 0 | 0 |
| 24.02.2019 17:00 - 18:00 | 0 | -50 | 0 | 0 |
| 24.02.2019 18:00 - 19:00 | 0 | -50 | 0 | 0 |
| 24.02.2019 19:00 - 20:00 | 0 | -50 | 0 | 0 |
| 24.02.2019 20:00 - 21:00 | 0 | -50 | 0 | 0 |
| 24.02.2019 21:00 - 22:00 | 0 | -50 | 0 | 0 |
| 24.02.2019 22:00 - 23:00 | 0 | -50 | 0 | 0 |
| 24.02.2019 23:00 - 24:00 | 0 | -50 | 0 | 0 |
| 25.02.2019 00:00 - 01:00 | 0 | -50 | 0 | 0 |
| 25.02.2019 01:00 - 02:00 | 0 | -50 | 0 | 0 |
| 25.02.2019 02:00 - 03:00 | 0 | -50 | 0 | 0 |
| 25.02.2019 03:00 - 04:00 | 0 | -50 | 0 | 0 |
| 25.02.2019 04:00 - 05:00 | 0 | -50 | 0 | 0 |
| 25.02.2019 05:00 - 06:00 | 0 | -50 | 0 | 0 |
| 25.02.2019 06:00 - 07:00 | 0 | 0 | 0 | 0 |
| 25.02.2019 07:00 - 08:00 | 0 | 0 | 0 | 0 |
| 25.02.2019 08:00 - 09:00 | 0 | 0 | 0 | 0 |
| 25.02.2019 09:00 - 10:00 | 0 | 0 | 0 | 0 |
| 25.02.2019 10:00 - 11:00 | 0 | 0 | 0 | 0 |
| 25.02.2019 11:00 - 12:00 | 0 | 0 | 0 | 0 |
| 25.02.2019 12:00 - 13:00 | 0 | 0 | 0 | 0 |
| 25.02.2019 13:00 - 14:00 | 0 | 0 | 0 | 0 |
| 25.02.2019 14:00 - 15:00 | 0 | 0 | 0 | 0 |
| 25.02.2019 15:00 - 16:00 | 0 | 0 | 0 | 0 |
| 25.02.2019 16:00 - 17:00 | 0 | 0 | 0 | 0 |
| 25.02.2019 17:00 - 18:00 | 0 | 0 | 0 | 0 |
| 25.02.2019 18:00 - 19:00 | 0 | 0 | 0 | 0 |
| 25.02.2019 19:00 - 20:00 | 0 | 0 | 0 | 0 |
| 25.02.2019 20:00 - 21:00 | 0 | 0 | 0 | 0 |
| 25.02.2019 21:00 - 22:00 | 0 | 0 | 0 | 0 |
| 25.02.2019 22:00 - 23:00 | 0 | -50 | 0 | 0 |
| 25.02.2019 23:00 - 24:00 | 0 | -50 | 0 | 0 |
| 26.02.2019 00:00 - 01:00 | 0 | -100 | 0 | 0 |
| 26.02.2019 01:00 - 02:00 | 0 | -100 | 0 | 0 |
| 26.02.2019 02:00 - 03:00 | 0 | -170 | 0 | 0 |
| 26.02.2019 03:00 - 04:00 | 0 | -170 | 0 | 0 |
| 26.02.2019 04:00 - 05:00 | 0 | -170 | 0 | 0 |
| 26.02.2019 05:00 - 06:00 | 0 | -170 | 0 | 0 |
| 26.02.2019 06:00 - 07:00 | 0 | 0 | 0 | 0 |
| 26.02.2019 07:00 - 08:00 | 0 | 0 | 0 | 0 |
| 26.02.2019 08:00 - 09:00 | 0 | 0 | 0 | 0 |
| 26.02.2019 09:00 - 10:00 | 0 | 0 | 0 | 0 |
| 26.02.2019 10:00 - 11:00 | 0 | 0 | 0 | 0 |
| 26.02.2019 11:00 - 12:00 | 0 | 0 | 0 | 0 |
| 26.02.2019 12:00 - 13:00 | 0 | 0 | 0 | 0 |
| 26.02.2019 13:00 - 14:00 | 0 | 0 | 0 | 0 |
| 26.02.2019 14:00 - 15:00 | 0 | 0 | 0 | 0 |
| 26.02.2019 15:00 - 16:00 | 0 | 0 | 0 | 0 |
| 26.02.2019 16:00 - 17:00 | 0 | 0 | 0 | 0 |
| 26.02.2019 17:00 - 18:00 | 0 | 0 | 0 | 0 |
| 26.02.2019 18:00 - 19:00 | 0 | 0 | 0 | 0 |
| 26.02.2019 19:00 - 20:00 | 0 | 0 | 0 | 0 |
| 26.02.2019 20:00 - 21:00 | 0 | 0 | 0 | 0 |
| 26.02.2019 21:00 - 22:00 | 0 | 0 | 0 | 0 |
| 26.02.2019 22:00 - 23:00 | 0 | 0 | 0 | 0 |
| 26.02.2019 23:00 - 24:00 | 0 | 0 | 0 | 0 |
| 27.02.2019 00:00 - 01:00 | 0 | -50 | 0 | 0 |
| 27.02.2019 01:00 - 02:00 | 0 | -50 | 0 | 0 |
| 27.02.2019 02:00 - 03:00 | 0 | -50 | 0 | 0 |
| 27.02.2019 03:00 - 04:00 | 0 | -50 | 0 | 0 |
| 27.02.2019 04:00 - 05:00 | 0 | -50 | 0 | 0 |
| 27.02.2019 05:00 - 06:00 | 0 | -50 | 0 | 0 |
| 27.02.2019 06:00 - 07:00 | 0 | 0 | 0 | 0 |
| 27.02.2019 07:00 - 08:00 | 0 | 0 | 0 | 0 |
| 27.02.2019 08:00 - 09:00 | 0 | 0 | 0 | 0 |
| 27.02.2019 09:00 - 10:00 | 0 | 0 | 0 | 0 |
| 27.02.2019 10:00 - 11:00 | 0 | 0 | 0 | 0 |
| 27.02.2019 11:00 - 12:00 | 0 | 0 | 0 | 0 |
| 27.02.2019 12:00 - 13:00 | 0 | 0 | 0 | 0 |
| 27.02.2019 13:00 - 14:00 | 0 | 0 | 0 | 0 |
| 27.02.2019 14:00 - 15:00 | 0 | 0 | 0 | 0 |
| 27.02.2019 15:00 - 16:00 | 0 | 0 | 0 | 0 |
| 27.02.2019 16:00 - 17:00 | 0 | 0 | 0 | 0 |
| 27.02.2019 17:00 - 18:00 | 0 | 0 | 0 | 0 |
| 27.02.2019 18:00 - 19:00 | 0 | 0 | 0 | 0 |
| 27.02.2019 19:00 - 20:00 | 0 | 0 | 0 | 0 |
| 27.02.2019 20:00 - 21:00 | 0 | 0 | 0 | 0 |
| 27.02.2019 21:00 - 22:00 | 0 | 0 | 0 | 0 |
| 27.02.2019 22:00 - 23:00 | 0 | 0 | 0 | 0 |
| 27.02.2019 23:00 - 24:00 | 0 | 0 | 0 | 0 |
| 28.02.2019 00:00 - 01:00 | 0 | -100 | 0 | 0 |
| 28.02.2019 01:00 - 02:00 | 0 | -100 | 0 | 0 |
| 28.02.2019 02:00 - 03:00 | 0 | -100 | 0 | 0 |
| 28.02.2019 03:00 - 04:00 | 0 | -100 | 0 | 0 |
| 28.02.2019 04:00 - 05:00 | 0 | -100 | 0 | 0 |
| 28.02.2019 05:00 - 06:00 | 0 | -100 | 0 | 0 |
| 28.02.2019 06:00 - 07:00 | 0 | 0 | 0 | 0 |
| 28.02.2019 07:00 - 08:00 | 0 | 0 | 0 | 0 |
| 28.02.2019 08:00 - 09:00 | 0 | 0 | 0 | 0 |
| 28.02.2019 09:00 - 10:00 | 0 | 0 | 0 | 0 |
| 28.02.2019 10:00 - 11:00 | 0 | 0 | 0 | 0 |
| 28.02.2019 11:00 - 12:00 | 0 | 0 | 0 | 0 |
| 28.02.2019 12:00 - 13:00 | 0 | 0 | 0 | 0 |
| 28.02.2019 13:00 - 14:00 | 0 | 0 | 0 | 0 |
| 28.02.2019 14:00 - 15:00 | 0 | 0 | 0 | 0 |
| 28.02.2019 15:00 - 16:00 | 0 | 0 | 0 | 0 |
| 28.02.2019 16:00 - 17:00 | 0 | 0 | 0 | 0 |
| 28.02.2019 17:00 - 18:00 | 0 | 0 | 0 | 0 |
| 28.02.2019 18:00 - 19:00 | 0 | 0 | 0 | 0 |
| 28.02.2019 19:00 - 20:00 | 0 | 0 | 0 | 0 |
| 28.02.2019 20:00 - 21:00 | 0 | 0 | 0 | 0 |
| 28.02.2019 21:00 - 22:00 | 0 | 0 | 0 | 0 |
| 28.02.2019 22:00 - 23:00 | 0 | -50 | 0 | 0 |
| 28.02.2019 23:00 - 24:00 | 0 | -110 | 0 | 0 |
| 01.03.2019 00:00 - 01:00 | 0 | -170 | 0 | 0 |
| 01.03.2019 01:00 - 02:00 | 0 | -170 | 0 | 0 |
| 01.03.2019 02:00 - 03:00 | 0 | -170 | 0 | 0 |
| 01.03.2019 03:00 - 04:00 | 0 | -170 | 0 | 0 |
| 01.03.2019 04:00 - 05:00 | 0 | -170 | 0 | 0 |
| 01.03.2019 05:00 - 06:00 | 0 | -170 | 0 | 0 |